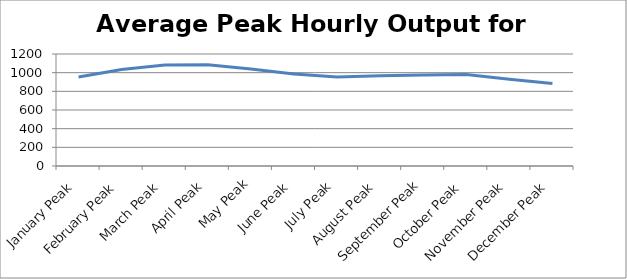
| Category | Average Peak Hourly Output for Month |
|---|---|
| January Peak | 953.239 |
| February Peak | 1033.224 |
| March Peak | 1081.204 |
| April Peak | 1085.532 |
| May Peak | 1038.169 |
| June Peak | 986.162 |
| July Peak | 954.847 |
| August Peak | 967.394 |
| September Peak | 974.499 |
| October Peak | 981.116 |
| November Peak | 930.1 |
| December Peak | 885.171 |